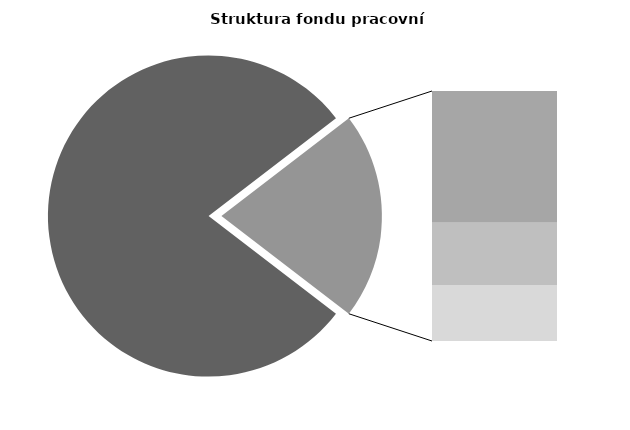
| Category | Series 0 |
|---|---|
| Průměrná měsíční odpracovaná doba bez přesčasu | 135.498 |
| Dovolená | 18.805 |
| Nemoc | 8.844 |
| Jiné | 8.002 |